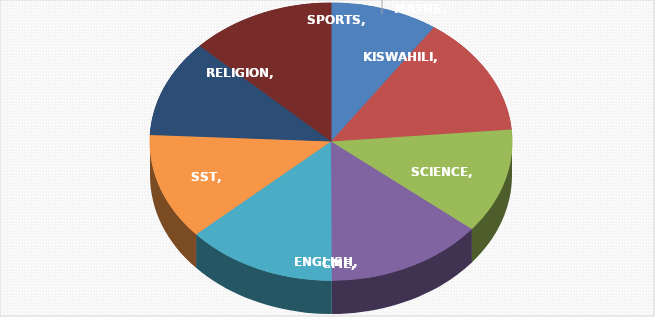
| Category | PERCENTAGE |
|---|---|
| MATHS | 0.556 |
| KISWAHILI | 0.81 |
| SCIENCE | 0.708 |
| ENGLISH | 0.815 |
| CME | 0.776 |
| SST | 0.718 |
| RELIGION | 0.657 |
| SPORTS | 0.746 |